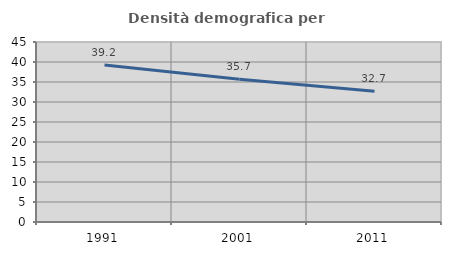
| Category | Densità demografica |
|---|---|
| 1991.0 | 39.242 |
| 2001.0 | 35.682 |
| 2011.0 | 32.683 |